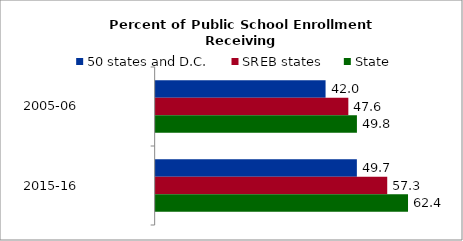
| Category | 50 states and D.C. | SREB states | State |
|---|---|---|---|
| 2005-06 | 42.008 | 47.638 | 49.76 |
| 2015-16 | 49.747 | 57.254 | 62.395 |